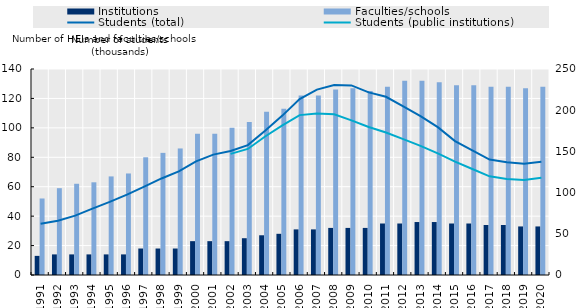
| Category | Institutions | Faculties/schools |
|---|---|---|
| 1991.0 | 13 | 52 |
| 1992.0 | 14 | 59 |
| 1993.0 | 14 | 62 |
| 1994.0 | 14 | 63 |
| 1995.0 | 14 | 67 |
| 1996.0 | 14 | 69 |
| 1997.0 | 18 | 80 |
| 1998.0 | 18 | 83 |
| 1999.0 | 18 | 86 |
| 2000.0 | 23 | 96 |
| 2001.0 | 23 | 96 |
| 2002.0 | 23 | 100 |
| 2003.0 | 25 | 104 |
| 2004.0 | 27 | 111 |
| 2005.0 | 28 | 113 |
| 2006.0 | 31 | 122 |
| 2007.0 | 31 | 122 |
| 2008.0 | 32 | 126 |
| 2009.0 | 32 | 127 |
| 2010.0 | 32 | 125 |
| 2011.0 | 35 | 128 |
| 2012.0 | 35 | 132 |
| 2013.0 | 36 | 132 |
| 2014.0 | 36 | 131 |
| 2015.0 | 35 | 129 |
| 2016.0 | 35 | 129 |
| 2017.0 | 34 | 128 |
| 2018.0 | 34 | 128 |
| 2019.0 | 33 | 127 |
| 2020.0 | 33 | 128 |